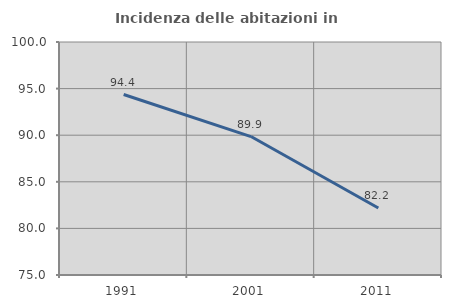
| Category | Incidenza delle abitazioni in proprietà  |
|---|---|
| 1991.0 | 94.366 |
| 2001.0 | 89.855 |
| 2011.0 | 82.192 |